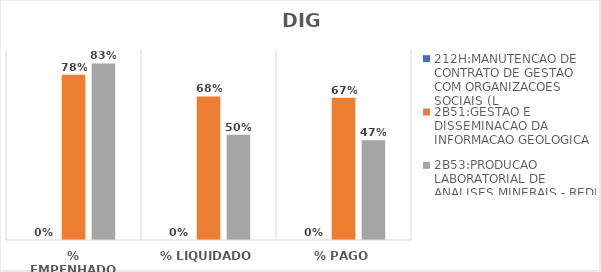
| Category | 212H:MANUTENCAO DE CONTRATO DE GESTAO COM ORGANIZACOES SOCIAIS (L | 2B51:GESTAO E DISSEMINACAO DA INFORMACAO GEOLOGICA | 2B53:PRODUCAO LABORATORIAL DE ANALISES MINERAIS - REDE LAMIN |
|---|---|---|---|
| % EMPENHADO | 0 | 0.779 | 0.832 |
| % LIQUIDADO | 0 | 0.677 | 0.496 |
| % PAGO | 0 | 0.67 | 0.47 |